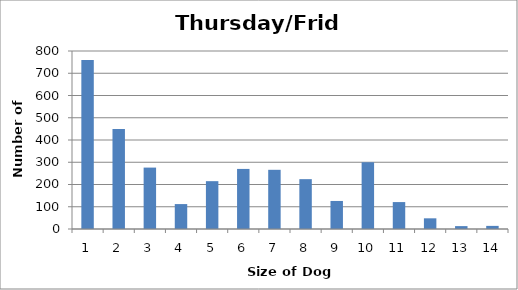
| Category | Series 0 |
|---|---|
| 0 | 760 |
| 1 | 450 |
| 2 | 276 |
| 3 | 112 |
| 4 | 215 |
| 5 | 270 |
| 6 | 266 |
| 7 | 224 |
| 8 | 126 |
| 9 | 300 |
| 10 | 121 |
| 11 | 48 |
| 12 | 13 |
| 13 | 14 |